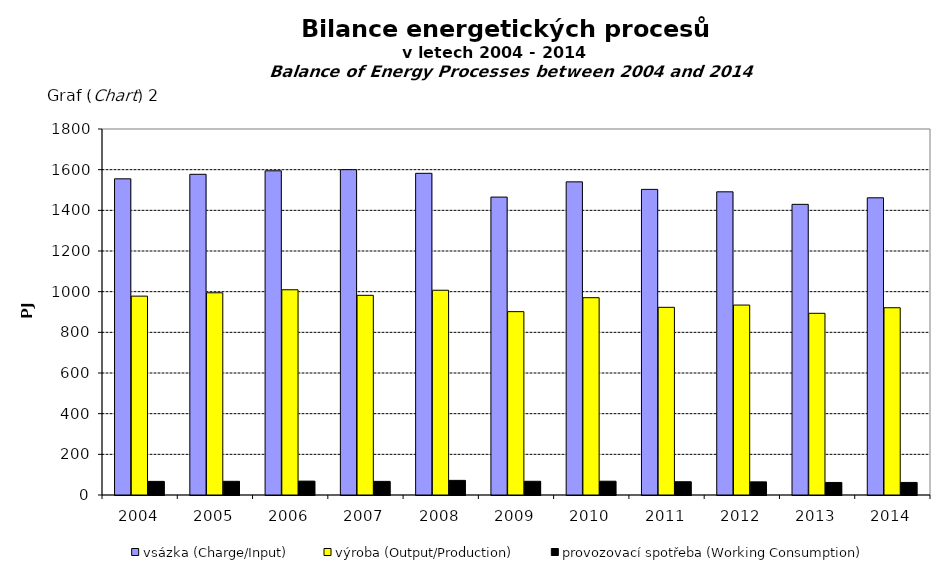
| Category | vsázka (Charge/Input) | výroba (Output/Production) | provozovací spotřeba (Working Consumption) |
|---|---|---|---|
| 2004.0 | 1555 | 978 | 67 |
| 2005.0 | 1577.209 | 994.448 | 67.261 |
| 2006.0 | 1594.403 | 1009.322 | 68.3 |
| 2007.0 | 1600 | 982 | 67 |
| 2008.0 | 1582 | 1007 | 72 |
| 2009.0 | 1465.135 | 901.747 | 67.43 |
| 2010.0 | 1540.058 | 970.341 | 67.788 |
| 2011.0 | 1503 | 923 | 65.3 |
| 2012.0 | 1491.072 | 934.187 | 64.637 |
| 2013.0 | 1429.401 | 893.567 | 61.696 |
| 2014.0 | 1461.626 | 920.962 | 61.794 |